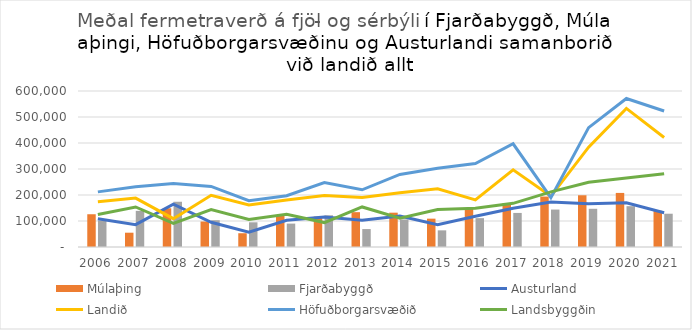
| Category | Múlaþing | Fjarðabyggð |
|---|---|---|
| 2006.0 | 126000 | 102000 |
| 2007.0 | 55000 | 139000 |
| 2008.0 | 149000 | 174000 |
| 2009.0 | 98000 | 103000 |
| 2010.0 | 53000 | 95000 |
| 2011.0 | 121000 | 90000 |
| 2012.0 | 117000 | 122000 |
| 2013.0 | 134000 | 69000 |
| 2014.0 | 132000 | 106000 |
| 2015.0 | 109000 | 64000 |
| 2016.0 | 148000 | 111000 |
| 2017.0 | 169000 | 131000 |
| 2018.0 | 194000 | 144000 |
| 2019.0 | 199000 | 147000 |
| 2020.0 | 208000 | 157000 |
| 2021.0 | 139000 | 128000 |